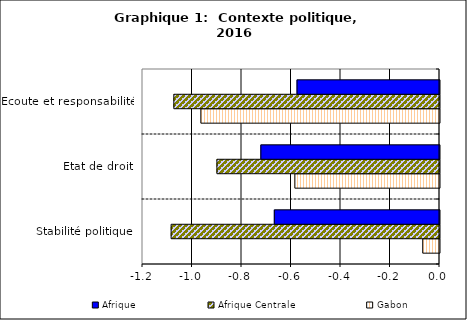
| Category | Gabon | Afrique Centrale | Afrique |
|---|---|---|---|
| Stabilité politique | -0.068 | -1.084 | -0.667 |
| Etat de droit | -0.584 | -0.899 | -0.722 |
| Ecoute et responsabilité | -0.964 | -1.073 | -0.576 |